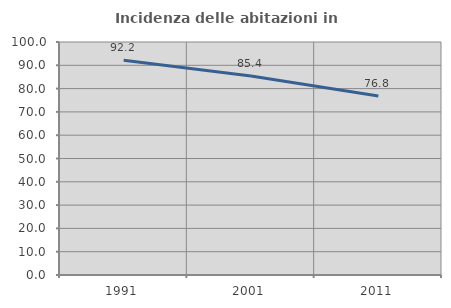
| Category | Incidenza delle abitazioni in proprietà  |
|---|---|
| 1991.0 | 92.211 |
| 2001.0 | 85.427 |
| 2011.0 | 76.794 |